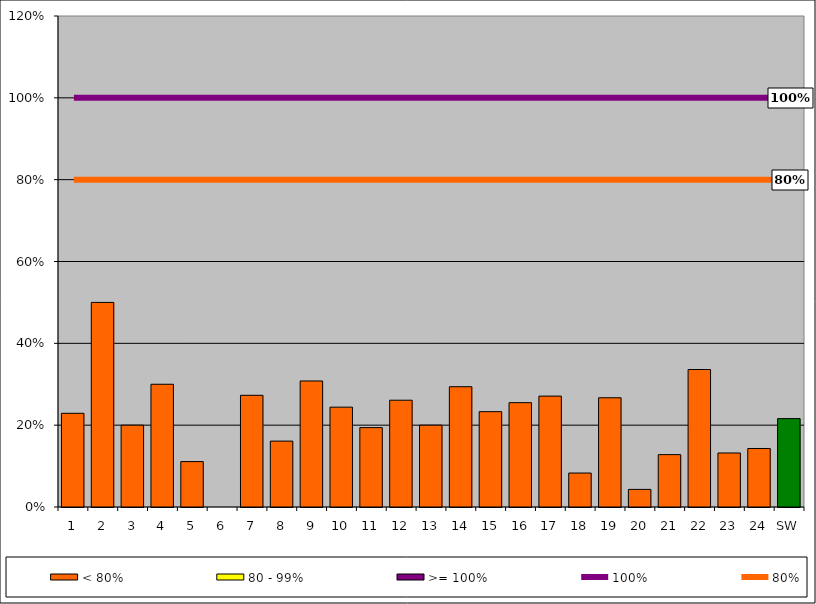
| Category | < 80% | 80 - 99% | >= 100% |
|---|---|---|---|
| 1 | 0.229 | 0 | 0 |
| 2 | 0.5 | 0 | 0 |
| 3 | 0.2 | 0 | 0 |
| 4 | 0.3 | 0 | 0 |
| 5 | 0.111 | 0 | 0 |
| 6 | 0 | 0 | 0 |
| 7 | 0.273 | 0 | 0 |
| 8 | 0.161 | 0 | 0 |
| 9 | 0.308 | 0 | 0 |
| 10 | 0.244 | 0 | 0 |
| 11 | 0.194 | 0 | 0 |
| 12 | 0.261 | 0 | 0 |
| 13 | 0.2 | 0 | 0 |
| 14 | 0.294 | 0 | 0 |
| 15 | 0.233 | 0 | 0 |
| 16 | 0.255 | 0 | 0 |
| 17 | 0.271 | 0 | 0 |
| 18 | 0.083 | 0 | 0 |
| 19 | 0.267 | 0 | 0 |
| 20 | 0.043 | 0 | 0 |
| 21 | 0.128 | 0 | 0 |
| 22 | 0.336 | 0 | 0 |
| 23 | 0.132 | 0 | 0 |
| 24 | 0.143 | 0 | 0 |
| SW | 0.216 | 0 | 0 |